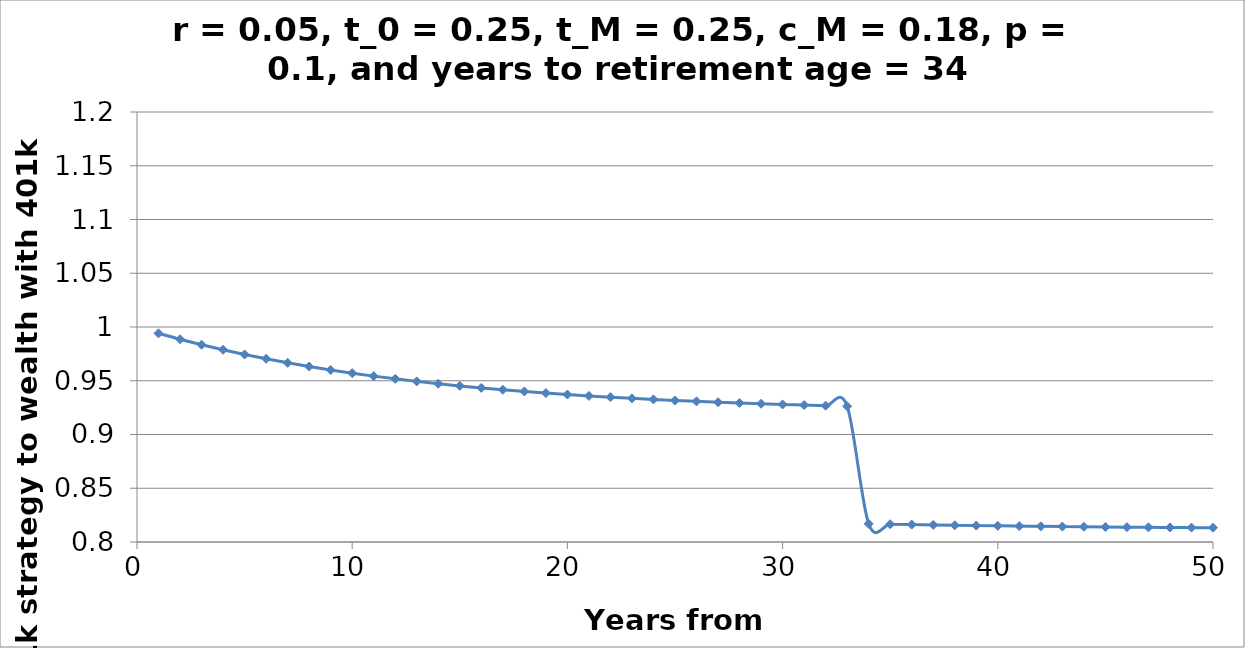
| Category | No401 / 401k |
|---|---|
| 1.0 | 0.994 |
| 2.0 | 0.989 |
| 3.0 | 0.984 |
| 4.0 | 0.979 |
| 5.0 | 0.974 |
| 6.0 | 0.97 |
| 7.0 | 0.967 |
| 8.0 | 0.963 |
| 9.0 | 0.96 |
| 10.0 | 0.957 |
| 11.0 | 0.954 |
| 12.0 | 0.952 |
| 13.0 | 0.949 |
| 14.0 | 0.947 |
| 15.0 | 0.945 |
| 16.0 | 0.943 |
| 17.0 | 0.942 |
| 18.0 | 0.94 |
| 19.0 | 0.939 |
| 20.0 | 0.937 |
| 21.0 | 0.936 |
| 22.0 | 0.935 |
| 23.0 | 0.934 |
| 24.0 | 0.933 |
| 25.0 | 0.932 |
| 26.0 | 0.931 |
| 27.0 | 0.93 |
| 28.0 | 0.929 |
| 29.0 | 0.929 |
| 30.0 | 0.928 |
| 31.0 | 0.927 |
| 32.0 | 0.927 |
| 33.0 | 0.926 |
| 34.0 | 0.817 |
| 35.0 | 0.817 |
| 36.0 | 0.816 |
| 37.0 | 0.816 |
| 38.0 | 0.816 |
| 39.0 | 0.815 |
| 40.0 | 0.815 |
| 41.0 | 0.815 |
| 42.0 | 0.815 |
| 43.0 | 0.814 |
| 44.0 | 0.814 |
| 45.0 | 0.814 |
| 46.0 | 0.814 |
| 47.0 | 0.814 |
| 48.0 | 0.814 |
| 49.0 | 0.813 |
| 50.0 | 0.813 |